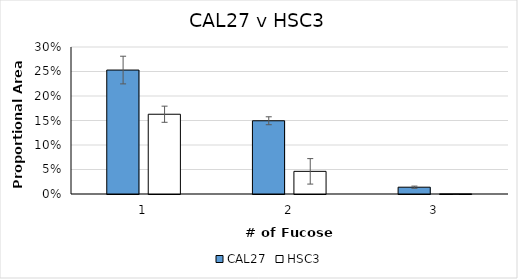
| Category | CAL27 | HSC3 |
|---|---|---|
| 1.0 | 0.253 | 0.163 |
| 2.0 | 0.149 | 0.046 |
| 3.0 | 0.014 | 0 |